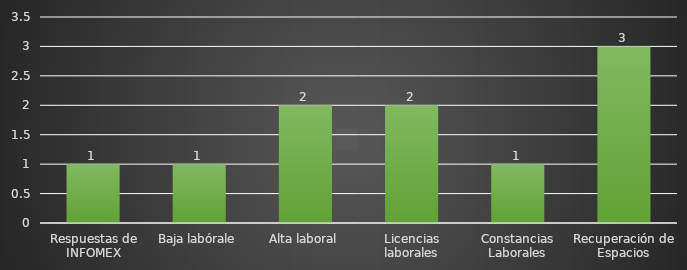
| Category | INDICADOR  |
|---|---|
| Respuestas de INFOMEX | 1 |
| Baja labórale | 1 |
| Alta laboral | 2 |
| Licencias laborales | 2 |
| Constancias Laborales | 1 |
| Recuperación de Espacios | 3 |